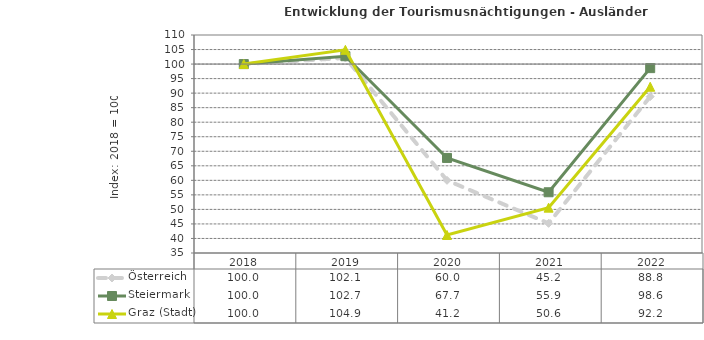
| Category | Österreich | Steiermark | Graz (Stadt) |
|---|---|---|---|
| 2022.0 | 88.8 | 98.6 | 92.2 |
| 2021.0 | 45.2 | 55.9 | 50.6 |
| 2020.0 | 60 | 67.7 | 41.2 |
| 2019.0 | 102.1 | 102.7 | 104.9 |
| 2018.0 | 100 | 100 | 100 |